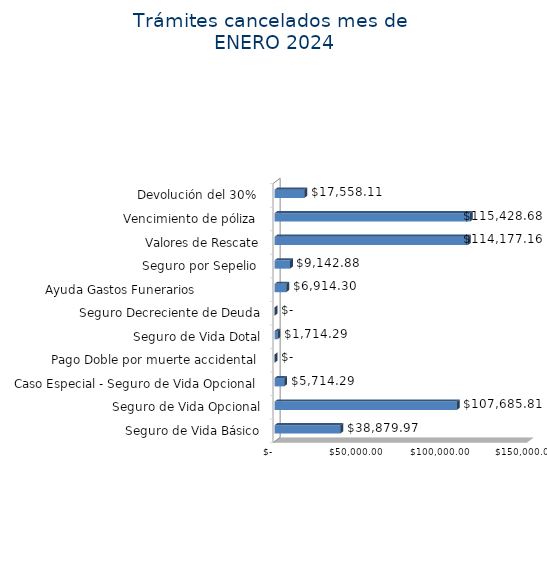
| Category | Monto  |
|---|---|
| Seguro de Vida Básico | 38879.97 |
| Seguro de Vida Opcional | 107685.81 |
| Caso Especial - Seguro de Vida Opcional  | 5714.29 |
| Pago Doble por muerte accidental  | 0 |
| Seguro de Vida Dotal | 1714.29 |
| Seguro Decreciente de Deuda | 0 |
| Ayuda Gastos Funerarios                  | 6914.3 |
| Seguro por Sepelio  | 9142.88 |
| Valores de Rescate | 114177.16 |
| Vencimiento de póliza  | 115428.68 |
| Devolución del 30%  | 17558.11 |